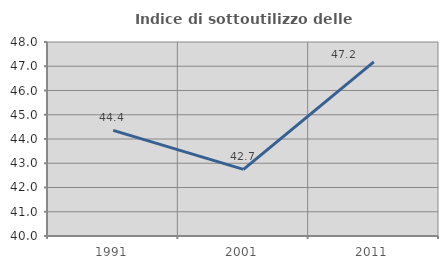
| Category | Indice di sottoutilizzo delle abitazioni  |
|---|---|
| 1991.0 | 44.356 |
| 2001.0 | 42.748 |
| 2011.0 | 47.181 |